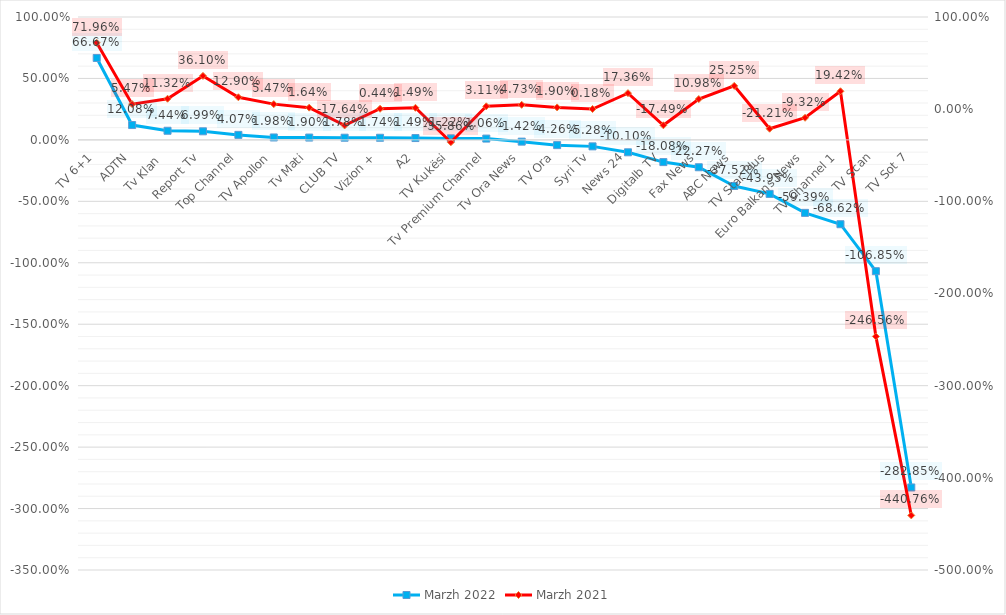
| Category | Marzh 2022 |
|---|---|
| TV 6+1 | 0.667 |
| ADTN | 0.121 |
| Tv Klan  | 0.074 |
| Report Tv | 0.07 |
| Top Channel | 0.041 |
| TV Apollon | 0.02 |
| Tv Mati | 0.019 |
| CLUB TV | 0.018 |
| Vizion + | 0.017 |
| A2 | 0.015 |
| TV Kukësi | 0.012 |
| Tv Premium Channel | 0.011 |
| Tv Ora News | -0.014 |
| TV Ora | -0.043 |
| Syri Tv | -0.053 |
| News 24 | -0.101 |
| Digitalb TV | -0.181 |
| Fax News | -0.223 |
| ABC News | -0.375 |
| TV Star Plus | -0.44 |
| Euro Balkans News | -0.594 |
| TV Channel 1 | -0.686 |
| TV Scan | -1.069 |
| TV Sot 7 | -2.828 |